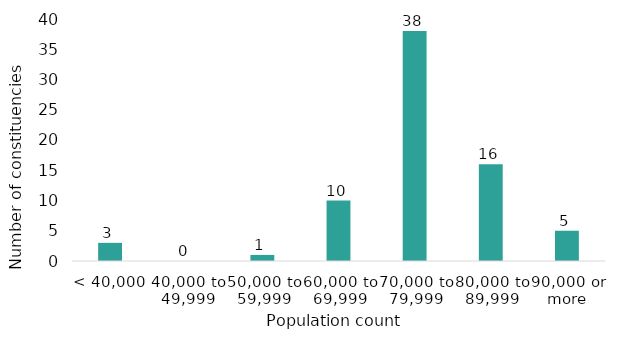
| Category | Number of constituencies |
|---|---|
| < 40,000 | 3 |
| 40,000 to 49,999 | 0 |
| 50,000 to 59,999 | 1 |
| 60,000 to 69,999 | 10 |
| 70,000 to 79,999 | 38 |
| 80,000 to 89,999 | 16 |
| 90,000 or more | 5 |